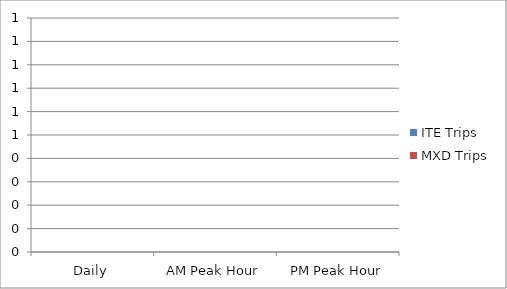
| Category | ITE Trips | MXD Trips |
|---|---|---|
| Daily | 0 | 0 |
| AM Peak Hour | 0 | 0 |
| PM Peak Hour | 0 | 0 |